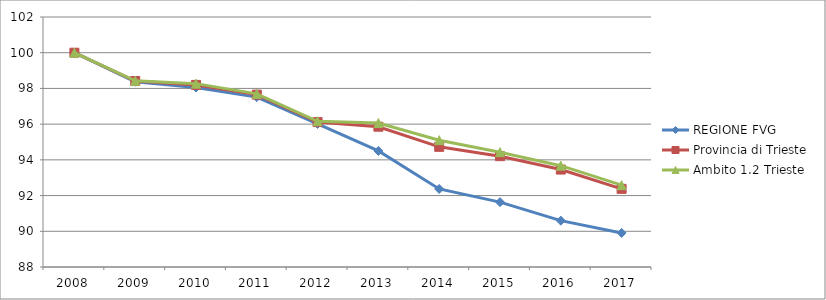
| Category | REGIONE FVG | Provincia di Trieste | Ambito 1.2 Trieste |
|---|---|---|---|
| 2008.0 | 100 | 100 | 100 |
| 2009.0 | 98.378 | 98.416 | 98.428 |
| 2010.0 | 98.049 | 98.197 | 98.268 |
| 2011.0 | 97.515 | 97.653 | 97.696 |
| 2012.0 | 96.012 | 96.115 | 96.162 |
| 2013.0 | 94.5 | 95.857 | 96.063 |
| 2014.0 | 92.37 | 94.73 | 95.101 |
| 2015.0 | 91.632 | 94.206 | 94.43 |
| 2016.0 | 90.595 | 93.457 | 93.675 |
| 2017.0 | 89.908 | 92.376 | 92.584 |